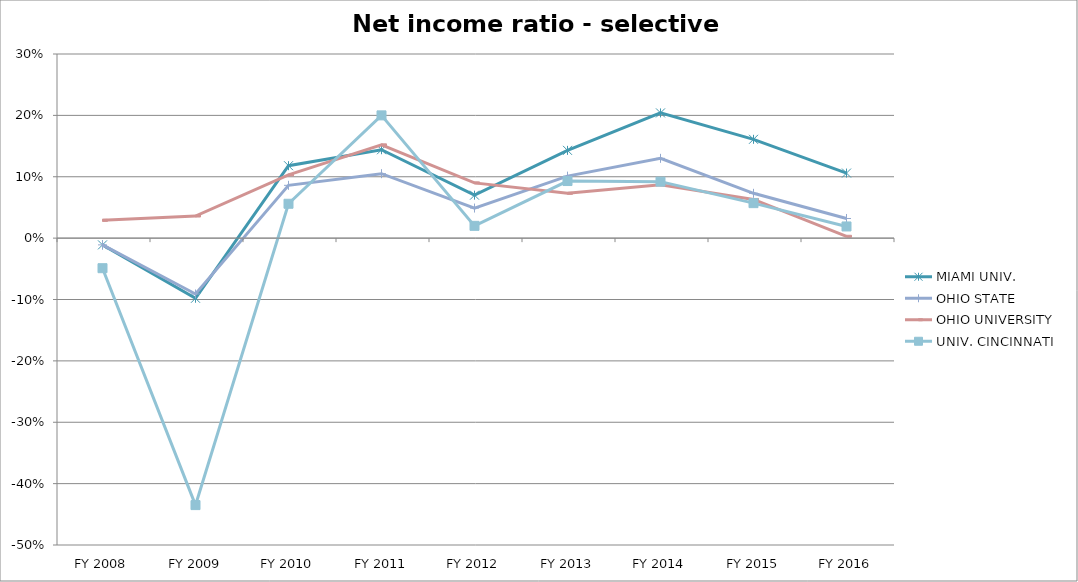
| Category | MIAMI UNIV.  | OHIO STATE  | OHIO UNIVERSITY  | UNIV. CINCINNATI  |
|---|---|---|---|---|
| FY 2016 | 0.106 | 0.032 | 0.003 | 0.019 |
| FY 2015 | 0.161 | 0.073 | 0.063 | 0.057 |
| FY 2014 | 0.204 | 0.13 | 0.087 | 0.092 |
| FY 2013 | 0.143 | 0.101 | 0.073 | 0.093 |
| FY 2012 | 0.07 | 0.049 | 0.09 | 0.02 |
| FY 2011 | 0.144 | 0.105 | 0.152 | 0.2 |
| FY 2010 | 0.118 | 0.086 | 0.103 | 0.056 |
| FY 2009 | -0.098 | -0.091 | 0.036 | -0.435 |
| FY 2008 | -0.011 | -0.011 | 0.029 | -0.049 |